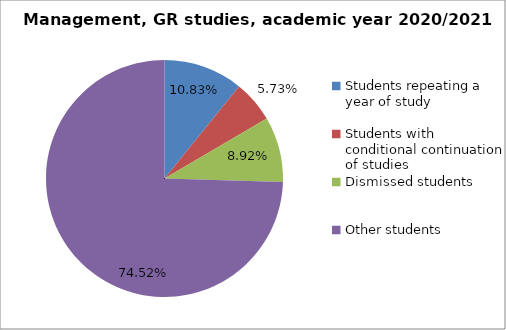
| Category | Series 0 |
|---|---|
| Students repeating a year of study | 34 |
| Students with conditional continuation of studies | 18 |
| Dismissed students | 28 |
| Other students | 234 |